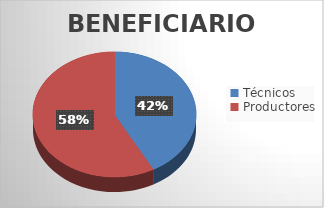
| Category | Series 0 |
|---|---|
| Técnicos | 109 |
| Productores | 150 |